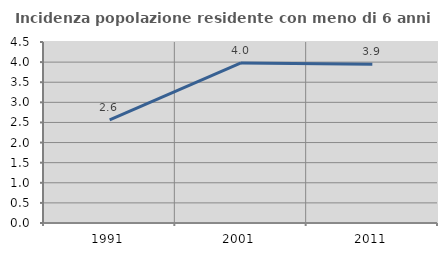
| Category | Incidenza popolazione residente con meno di 6 anni |
|---|---|
| 1991.0 | 2.563 |
| 2001.0 | 3.981 |
| 2011.0 | 3.949 |